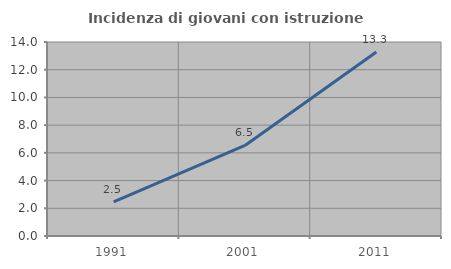
| Category | Incidenza di giovani con istruzione universitaria |
|---|---|
| 1991.0 | 2.454 |
| 2001.0 | 6.536 |
| 2011.0 | 13.281 |